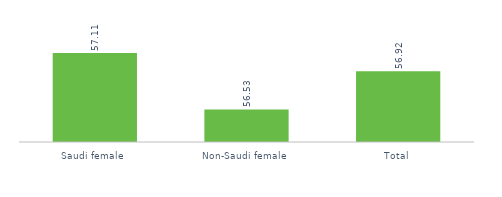
| Category | Series 0 |
|---|---|
| Saudi female  | 57.109 |
| Non-Saudi female | 56.533 |
| Total | 56.922 |